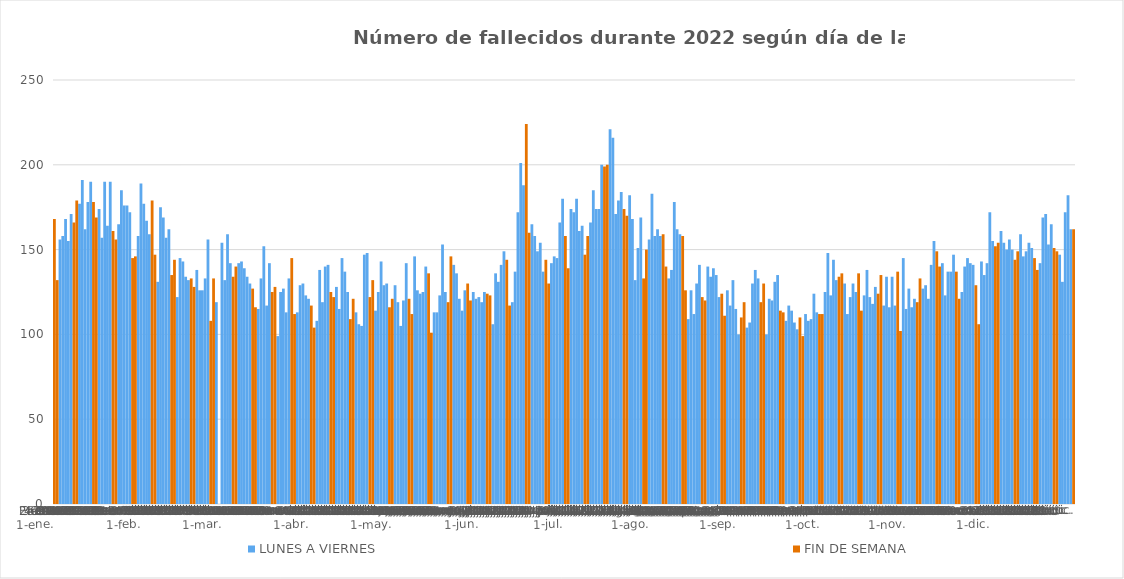
| Category | LUNES A VIERNES | FIN DE SEMANA |
|---|---|---|
| 0 | 0 | 168 |
| 1 | 0 | 132 |
| 2 | 156 | 0 |
| 3 | 158 | 0 |
| 4 | 168 | 0 |
| 5 | 155 | 0 |
| 6 | 171 | 0 |
| 7 | 0 | 166 |
| 8 | 0 | 179 |
| 9 | 177 | 0 |
| 10 | 191 | 0 |
| 11 | 162 | 0 |
| 12 | 178 | 0 |
| 13 | 190 | 0 |
| 14 | 0 | 178 |
| 15 | 0 | 169 |
| 16 | 174 | 0 |
| 17 | 157 | 0 |
| 18 | 190 | 0 |
| 19 | 164 | 0 |
| 20 | 190 | 0 |
| 21 | 0 | 161 |
| 22 | 0 | 156 |
| 23 | 165 | 0 |
| 24 | 185 | 0 |
| 25 | 176 | 0 |
| 26 | 176 | 0 |
| 27 | 172 | 0 |
| 28 | 0 | 145 |
| 29 | 0 | 146 |
| 30 | 158 | 0 |
| 31 | 189 | 0 |
| 32 | 177 | 0 |
| 33 | 167 | 0 |
| 34 | 159 | 0 |
| 35 | 0 | 179 |
| 36 | 0 | 147 |
| 37 | 131 | 0 |
| 38 | 175 | 0 |
| 39 | 169 | 0 |
| 40 | 157 | 0 |
| 41 | 162 | 0 |
| 42 | 0 | 135 |
| 43 | 0 | 144 |
| 44 | 122 | 0 |
| 45 | 145 | 0 |
| 46 | 143 | 0 |
| 47 | 134 | 0 |
| 48 | 132 | 0 |
| 49 | 0 | 133 |
| 50 | 0 | 128 |
| 51 | 138 | 0 |
| 52 | 126 | 0 |
| 53 | 126 | 0 |
| 54 | 133 | 0 |
| 55 | 156 | 0 |
| 56 | 0 | 108 |
| 57 | 0 | 133 |
| 58 | 119 | 0 |
| 59 | 0 | 0 |
| 60 | 154 | 0 |
| 61 | 132 | 0 |
| 62 | 159 | 0 |
| 63 | 142 | 0 |
| 64 | 0 | 134 |
| 65 | 0 | 140 |
| 66 | 142 | 0 |
| 67 | 143 | 0 |
| 68 | 139 | 0 |
| 69 | 134 | 0 |
| 70 | 130 | 0 |
| 71 | 0 | 127 |
| 72 | 0 | 116 |
| 73 | 115 | 0 |
| 74 | 133 | 0 |
| 75 | 152 | 0 |
| 76 | 117 | 0 |
| 77 | 142 | 0 |
| 78 | 0 | 125 |
| 79 | 0 | 128 |
| 80 | 99 | 0 |
| 81 | 125 | 0 |
| 82 | 127 | 0 |
| 83 | 113 | 0 |
| 84 | 133 | 0 |
| 85 | 0 | 145 |
| 86 | 0 | 112 |
| 87 | 113 | 0 |
| 88 | 129 | 0 |
| 89 | 130 | 0 |
| 90 | 123 | 0 |
| 91 | 121 | 0 |
| 92 | 0 | 117 |
| 93 | 0 | 104 |
| 94 | 108 | 0 |
| 95 | 138 | 0 |
| 96 | 119 | 0 |
| 97 | 140 | 0 |
| 98 | 141 | 0 |
| 99 | 0 | 125 |
| 100 | 0 | 122 |
| 101 | 128 | 0 |
| 102 | 115 | 0 |
| 103 | 145 | 0 |
| 104 | 137 | 0 |
| 105 | 125 | 0 |
| 106 | 0 | 109 |
| 107 | 0 | 121 |
| 108 | 113 | 0 |
| 109 | 106 | 0 |
| 110 | 105 | 0 |
| 111 | 147 | 0 |
| 112 | 148 | 0 |
| 113 | 0 | 122 |
| 114 | 0 | 132 |
| 115 | 114 | 0 |
| 116 | 125 | 0 |
| 117 | 143 | 0 |
| 118 | 129 | 0 |
| 119 | 130 | 0 |
| 120 | 0 | 116 |
| 121 | 0 | 121 |
| 122 | 129 | 0 |
| 123 | 119 | 0 |
| 124 | 105 | 0 |
| 125 | 120 | 0 |
| 126 | 142 | 0 |
| 127 | 0 | 121 |
| 128 | 0 | 112 |
| 129 | 146 | 0 |
| 130 | 126 | 0 |
| 131 | 124 | 0 |
| 132 | 125 | 0 |
| 133 | 140 | 0 |
| 134 | 0 | 136 |
| 135 | 0 | 101 |
| 136 | 113 | 0 |
| 137 | 113 | 0 |
| 138 | 123 | 0 |
| 139 | 153 | 0 |
| 140 | 125 | 0 |
| 141 | 0 | 119 |
| 142 | 0 | 146 |
| 143 | 141 | 0 |
| 144 | 136 | 0 |
| 145 | 121 | 0 |
| 146 | 114 | 0 |
| 147 | 126 | 0 |
| 148 | 0 | 130 |
| 149 | 0 | 120 |
| 150 | 125 | 0 |
| 151 | 121 | 0 |
| 152 | 122 | 0 |
| 153 | 119 | 0 |
| 154 | 125 | 0 |
| 155 | 0 | 124 |
| 156 | 0 | 123 |
| 157 | 106 | 0 |
| 158 | 136 | 0 |
| 159 | 131 | 0 |
| 160 | 141 | 0 |
| 161 | 149 | 0 |
| 162 | 0 | 144 |
| 163 | 0 | 117 |
| 164 | 119 | 0 |
| 165 | 137 | 0 |
| 166 | 172 | 0 |
| 167 | 201 | 0 |
| 168 | 188 | 0 |
| 169 | 0 | 224 |
| 170 | 0 | 160 |
| 171 | 165 | 0 |
| 172 | 158 | 0 |
| 173 | 149 | 0 |
| 174 | 154 | 0 |
| 175 | 137 | 0 |
| 176 | 0 | 144 |
| 177 | 0 | 130 |
| 178 | 142 | 0 |
| 179 | 146 | 0 |
| 180 | 145 | 0 |
| 181 | 166 | 0 |
| 182 | 180 | 0 |
| 183 | 0 | 158 |
| 184 | 0 | 139 |
| 185 | 174 | 0 |
| 186 | 172 | 0 |
| 187 | 180 | 0 |
| 188 | 161 | 0 |
| 189 | 164 | 0 |
| 190 | 0 | 147 |
| 191 | 0 | 158 |
| 192 | 166 | 0 |
| 193 | 185 | 0 |
| 194 | 174 | 0 |
| 195 | 174 | 0 |
| 196 | 200 | 0 |
| 197 | 0 | 199 |
| 198 | 0 | 200 |
| 199 | 221 | 0 |
| 200 | 216 | 0 |
| 201 | 171 | 0 |
| 202 | 179 | 0 |
| 203 | 184 | 0 |
| 204 | 0 | 174 |
| 205 | 0 | 170 |
| 206 | 182 | 0 |
| 207 | 168 | 0 |
| 208 | 132 | 0 |
| 209 | 151 | 0 |
| 210 | 169 | 0 |
| 211 | 0 | 133 |
| 212 | 0 | 150 |
| 213 | 156 | 0 |
| 214 | 183 | 0 |
| 215 | 158 | 0 |
| 216 | 162 | 0 |
| 217 | 158 | 0 |
| 218 | 0 | 159 |
| 219 | 0 | 140 |
| 220 | 133 | 0 |
| 221 | 138 | 0 |
| 222 | 178 | 0 |
| 223 | 162 | 0 |
| 224 | 159 | 0 |
| 225 | 0 | 158 |
| 226 | 0 | 126 |
| 227 | 109 | 0 |
| 228 | 126 | 0 |
| 229 | 112 | 0 |
| 230 | 130 | 0 |
| 231 | 141 | 0 |
| 232 | 0 | 122 |
| 233 | 0 | 120 |
| 234 | 140 | 0 |
| 235 | 134 | 0 |
| 236 | 139 | 0 |
| 237 | 135 | 0 |
| 238 | 122 | 0 |
| 239 | 0 | 124 |
| 240 | 0 | 111 |
| 241 | 126 | 0 |
| 242 | 117 | 0 |
| 243 | 132 | 0 |
| 244 | 115 | 0 |
| 245 | 100 | 0 |
| 246 | 0 | 110 |
| 247 | 0 | 119 |
| 248 | 104 | 0 |
| 249 | 107 | 0 |
| 250 | 130 | 0 |
| 251 | 138 | 0 |
| 252 | 133 | 0 |
| 253 | 0 | 119 |
| 254 | 0 | 130 |
| 255 | 100 | 0 |
| 256 | 121 | 0 |
| 257 | 120 | 0 |
| 258 | 131 | 0 |
| 259 | 135 | 0 |
| 260 | 0 | 114 |
| 261 | 0 | 113 |
| 262 | 108 | 0 |
| 263 | 117 | 0 |
| 264 | 114 | 0 |
| 265 | 107 | 0 |
| 266 | 103 | 0 |
| 267 | 0 | 110 |
| 268 | 0 | 99 |
| 269 | 112 | 0 |
| 270 | 108 | 0 |
| 271 | 109 | 0 |
| 272 | 124 | 0 |
| 273 | 113 | 0 |
| 274 | 0 | 112 |
| 275 | 0 | 112 |
| 276 | 125 | 0 |
| 277 | 148 | 0 |
| 278 | 123 | 0 |
| 279 | 144 | 0 |
| 280 | 132 | 0 |
| 281 | 0 | 134 |
| 282 | 0 | 136 |
| 283 | 130 | 0 |
| 284 | 112 | 0 |
| 285 | 122 | 0 |
| 286 | 130 | 0 |
| 287 | 125 | 0 |
| 288 | 0 | 136 |
| 289 | 0 | 114 |
| 290 | 123 | 0 |
| 291 | 138 | 0 |
| 292 | 122 | 0 |
| 293 | 118 | 0 |
| 294 | 128 | 0 |
| 295 | 0 | 124 |
| 296 | 0 | 135 |
| 297 | 117 | 0 |
| 298 | 134 | 0 |
| 299 | 116 | 0 |
| 300 | 134 | 0 |
| 301 | 117 | 0 |
| 302 | 0 | 137 |
| 303 | 0 | 102 |
| 304 | 145 | 0 |
| 305 | 115 | 0 |
| 306 | 127 | 0 |
| 307 | 116 | 0 |
| 308 | 121 | 0 |
| 309 | 0 | 119 |
| 310 | 0 | 133 |
| 311 | 127 | 0 |
| 312 | 129 | 0 |
| 313 | 121 | 0 |
| 314 | 141 | 0 |
| 315 | 155 | 0 |
| 316 | 0 | 149 |
| 317 | 0 | 140 |
| 318 | 142 | 0 |
| 319 | 123 | 0 |
| 320 | 137 | 0 |
| 321 | 137 | 0 |
| 322 | 147 | 0 |
| 323 | 0 | 137 |
| 324 | 0 | 121 |
| 325 | 125 | 0 |
| 326 | 140 | 0 |
| 327 | 145 | 0 |
| 328 | 142 | 0 |
| 329 | 141 | 0 |
| 330 | 0 | 129 |
| 331 | 0 | 106 |
| 332 | 143 | 0 |
| 333 | 135 | 0 |
| 334 | 142 | 0 |
| 335 | 172 | 0 |
| 336 | 155 | 0 |
| 337 | 0 | 152 |
| 338 | 0 | 154 |
| 339 | 161 | 0 |
| 340 | 154 | 0 |
| 341 | 150 | 0 |
| 342 | 156 | 0 |
| 343 | 150 | 0 |
| 344 | 0 | 144 |
| 345 | 0 | 149 |
| 346 | 159 | 0 |
| 347 | 146 | 0 |
| 348 | 149 | 0 |
| 349 | 154 | 0 |
| 350 | 151 | 0 |
| 351 | 0 | 145 |
| 352 | 0 | 138 |
| 353 | 142 | 0 |
| 354 | 169 | 0 |
| 355 | 171 | 0 |
| 356 | 153 | 0 |
| 357 | 165 | 0 |
| 358 | 0 | 151 |
| 359 | 0 | 149 |
| 360 | 147 | 0 |
| 361 | 131 | 0 |
| 362 | 172 | 0 |
| 363 | 182 | 0 |
| 364 | 162 | 0 |
| 365 | 0 | 162 |